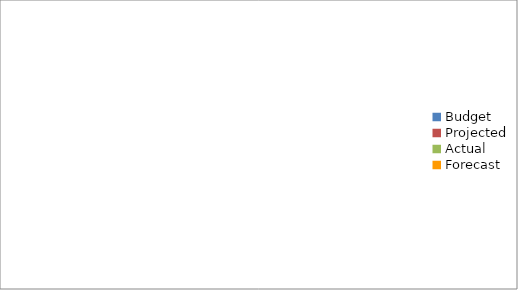
| Category | Series 0 |
|---|---|
| Budget | 3260 |
| Projected | 2850 |
| Actual | 2260 |
| Forecast | 1570 |